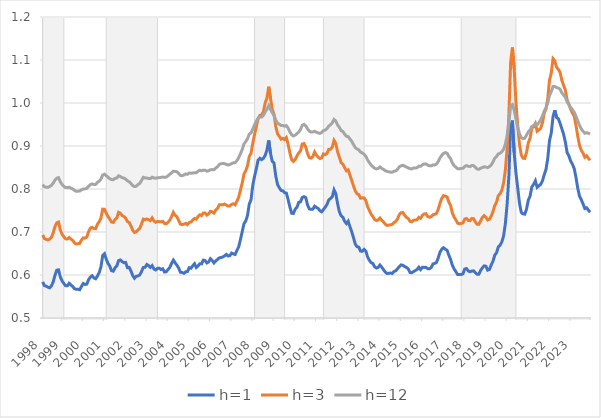
| Category | h=1 | h=3 | h=12 |
|---|---|---|---|
| 1998-02-01 | 0.584 | 0.693 | 0.81 |
| 1998-03-01 | 0.575 | 0.685 | 0.805 |
| 1998-04-01 | 0.574 | 0.683 | 0.804 |
| 1998-05-01 | 0.572 | 0.682 | 0.804 |
| 1998-06-01 | 0.57 | 0.684 | 0.806 |
| 1998-07-01 | 0.575 | 0.688 | 0.808 |
| 1998-08-01 | 0.584 | 0.698 | 0.814 |
| 1998-09-01 | 0.6 | 0.713 | 0.821 |
| 1998-10-01 | 0.611 | 0.721 | 0.825 |
| 1998-11-01 | 0.612 | 0.723 | 0.826 |
| 1998-12-01 | 0.596 | 0.705 | 0.817 |
| 1999-01-01 | 0.586 | 0.695 | 0.811 |
| 1999-02-01 | 0.58 | 0.689 | 0.806 |
| 1999-03-01 | 0.575 | 0.684 | 0.804 |
| 1999-04-01 | 0.575 | 0.684 | 0.803 |
| 1999-05-01 | 0.581 | 0.687 | 0.804 |
| 1999-06-01 | 0.577 | 0.684 | 0.802 |
| 1999-07-01 | 0.573 | 0.681 | 0.8 |
| 1999-08-01 | 0.568 | 0.675 | 0.797 |
| 1999-09-01 | 0.567 | 0.672 | 0.795 |
| 1999-10-01 | 0.567 | 0.673 | 0.795 |
| 1999-11-01 | 0.566 | 0.673 | 0.795 |
| 1999-12-01 | 0.574 | 0.681 | 0.798 |
| 2000-01-01 | 0.58 | 0.686 | 0.8 |
| 2000-02-01 | 0.578 | 0.686 | 0.8 |
| 2000-03-01 | 0.579 | 0.688 | 0.802 |
| 2000-04-01 | 0.589 | 0.7 | 0.806 |
| 2000-05-01 | 0.595 | 0.709 | 0.81 |
| 2000-06-01 | 0.598 | 0.711 | 0.812 |
| 2000-07-01 | 0.593 | 0.708 | 0.811 |
| 2000-08-01 | 0.591 | 0.708 | 0.811 |
| 2000-09-01 | 0.597 | 0.718 | 0.815 |
| 2000-10-01 | 0.605 | 0.724 | 0.818 |
| 2000-11-01 | 0.618 | 0.732 | 0.823 |
| 2000-12-01 | 0.645 | 0.753 | 0.832 |
| 2001-01-01 | 0.649 | 0.753 | 0.834 |
| 2001-02-01 | 0.637 | 0.744 | 0.831 |
| 2001-03-01 | 0.627 | 0.736 | 0.827 |
| 2001-04-01 | 0.621 | 0.73 | 0.824 |
| 2001-05-01 | 0.61 | 0.723 | 0.822 |
| 2001-06-01 | 0.609 | 0.722 | 0.822 |
| 2001-07-01 | 0.617 | 0.729 | 0.825 |
| 2001-08-01 | 0.621 | 0.733 | 0.826 |
| 2001-09-01 | 0.633 | 0.746 | 0.831 |
| 2001-10-01 | 0.635 | 0.744 | 0.829 |
| 2001-11-01 | 0.631 | 0.738 | 0.826 |
| 2001-12-01 | 0.629 | 0.736 | 0.825 |
| 2002-01-01 | 0.629 | 0.732 | 0.823 |
| 2002-02-01 | 0.617 | 0.724 | 0.819 |
| 2002-03-01 | 0.618 | 0.722 | 0.817 |
| 2002-04-01 | 0.609 | 0.714 | 0.813 |
| 2002-05-01 | 0.599 | 0.704 | 0.808 |
| 2002-06-01 | 0.592 | 0.699 | 0.806 |
| 2002-07-01 | 0.597 | 0.701 | 0.807 |
| 2002-08-01 | 0.598 | 0.705 | 0.81 |
| 2002-09-01 | 0.6 | 0.709 | 0.813 |
| 2002-10-01 | 0.608 | 0.719 | 0.82 |
| 2002-11-01 | 0.618 | 0.73 | 0.827 |
| 2002-12-01 | 0.618 | 0.729 | 0.826 |
| 2003-01-01 | 0.624 | 0.73 | 0.826 |
| 2003-02-01 | 0.622 | 0.728 | 0.824 |
| 2003-03-01 | 0.618 | 0.727 | 0.824 |
| 2003-04-01 | 0.622 | 0.733 | 0.827 |
| 2003-05-01 | 0.614 | 0.726 | 0.826 |
| 2003-06-01 | 0.612 | 0.722 | 0.825 |
| 2003-07-01 | 0.615 | 0.724 | 0.826 |
| 2003-08-01 | 0.616 | 0.724 | 0.826 |
| 2003-09-01 | 0.613 | 0.724 | 0.827 |
| 2003-10-01 | 0.614 | 0.725 | 0.828 |
| 2003-11-01 | 0.607 | 0.72 | 0.827 |
| 2003-12-01 | 0.608 | 0.719 | 0.828 |
| 2004-01-01 | 0.613 | 0.723 | 0.831 |
| 2004-02-01 | 0.618 | 0.728 | 0.834 |
| 2004-03-01 | 0.627 | 0.736 | 0.838 |
| 2004-04-01 | 0.635 | 0.746 | 0.841 |
| 2004-05-01 | 0.628 | 0.739 | 0.841 |
| 2004-06-01 | 0.623 | 0.736 | 0.84 |
| 2004-07-01 | 0.616 | 0.727 | 0.836 |
| 2004-08-01 | 0.606 | 0.718 | 0.832 |
| 2004-09-01 | 0.606 | 0.717 | 0.831 |
| 2004-10-01 | 0.604 | 0.718 | 0.833 |
| 2004-11-01 | 0.607 | 0.72 | 0.835 |
| 2004-12-01 | 0.608 | 0.717 | 0.834 |
| 2005-01-01 | 0.617 | 0.722 | 0.837 |
| 2005-02-01 | 0.616 | 0.723 | 0.837 |
| 2005-03-01 | 0.622 | 0.728 | 0.837 |
| 2005-04-01 | 0.626 | 0.732 | 0.838 |
| 2005-05-01 | 0.617 | 0.73 | 0.838 |
| 2005-06-01 | 0.621 | 0.736 | 0.841 |
| 2005-07-01 | 0.626 | 0.74 | 0.844 |
| 2005-08-01 | 0.626 | 0.738 | 0.842 |
| 2005-09-01 | 0.635 | 0.744 | 0.844 |
| 2005-10-01 | 0.633 | 0.744 | 0.844 |
| 2005-11-01 | 0.628 | 0.739 | 0.841 |
| 2005-12-01 | 0.63 | 0.742 | 0.842 |
| 2006-01-01 | 0.638 | 0.748 | 0.845 |
| 2006-02-01 | 0.634 | 0.747 | 0.845 |
| 2006-03-01 | 0.628 | 0.744 | 0.845 |
| 2006-04-01 | 0.632 | 0.751 | 0.849 |
| 2006-05-01 | 0.636 | 0.755 | 0.852 |
| 2006-06-01 | 0.64 | 0.763 | 0.857 |
| 2006-07-01 | 0.641 | 0.763 | 0.859 |
| 2006-08-01 | 0.642 | 0.763 | 0.859 |
| 2006-09-01 | 0.644 | 0.765 | 0.859 |
| 2006-10-01 | 0.648 | 0.763 | 0.857 |
| 2006-11-01 | 0.644 | 0.76 | 0.856 |
| 2006-12-01 | 0.645 | 0.761 | 0.857 |
| 2007-01-01 | 0.651 | 0.764 | 0.859 |
| 2007-02-01 | 0.649 | 0.766 | 0.861 |
| 2007-03-01 | 0.648 | 0.763 | 0.861 |
| 2007-04-01 | 0.657 | 0.771 | 0.866 |
| 2007-05-01 | 0.665 | 0.781 | 0.873 |
| 2007-06-01 | 0.682 | 0.797 | 0.882 |
| 2007-07-01 | 0.701 | 0.814 | 0.892 |
| 2007-08-01 | 0.719 | 0.835 | 0.905 |
| 2007-09-01 | 0.726 | 0.842 | 0.91 |
| 2007-10-01 | 0.739 | 0.854 | 0.917 |
| 2007-11-01 | 0.765 | 0.876 | 0.928 |
| 2007-12-01 | 0.775 | 0.883 | 0.931 |
| 2008-01-01 | 0.809 | 0.907 | 0.939 |
| 2008-02-01 | 0.83 | 0.927 | 0.949 |
| 2008-03-01 | 0.847 | 0.945 | 0.958 |
| 2008-04-01 | 0.867 | 0.964 | 0.964 |
| 2008-05-01 | 0.871 | 0.971 | 0.967 |
| 2008-06-01 | 0.868 | 0.972 | 0.967 |
| 2008-07-01 | 0.871 | 0.98 | 0.971 |
| 2008-08-01 | 0.878 | 1 | 0.979 |
| 2008-09-01 | 0.891 | 1.011 | 0.985 |
| 2008-10-01 | 0.913 | 1.038 | 0.994 |
| 2008-11-01 | 0.883 | 1.011 | 0.985 |
| 2008-12-01 | 0.864 | 0.985 | 0.977 |
| 2009-01-01 | 0.86 | 0.974 | 0.971 |
| 2009-02-01 | 0.83 | 0.946 | 0.96 |
| 2009-03-01 | 0.811 | 0.928 | 0.953 |
| 2009-04-01 | 0.803 | 0.923 | 0.951 |
| 2009-05-01 | 0.797 | 0.916 | 0.948 |
| 2009-06-01 | 0.796 | 0.918 | 0.948 |
| 2009-07-01 | 0.791 | 0.915 | 0.946 |
| 2009-08-01 | 0.791 | 0.92 | 0.948 |
| 2009-09-01 | 0.775 | 0.904 | 0.942 |
| 2009-10-01 | 0.758 | 0.884 | 0.933 |
| 2009-11-01 | 0.744 | 0.868 | 0.926 |
| 2009-12-01 | 0.743 | 0.864 | 0.923 |
| 2010-01-01 | 0.753 | 0.869 | 0.925 |
| 2010-02-01 | 0.758 | 0.877 | 0.929 |
| 2010-03-01 | 0.769 | 0.884 | 0.933 |
| 2010-04-01 | 0.77 | 0.889 | 0.938 |
| 2010-05-01 | 0.78 | 0.905 | 0.948 |
| 2010-06-01 | 0.782 | 0.906 | 0.95 |
| 2010-07-01 | 0.78 | 0.897 | 0.947 |
| 2010-08-01 | 0.763 | 0.883 | 0.94 |
| 2010-09-01 | 0.754 | 0.873 | 0.935 |
| 2010-10-01 | 0.753 | 0.872 | 0.933 |
| 2010-11-01 | 0.753 | 0.875 | 0.933 |
| 2010-12-01 | 0.76 | 0.886 | 0.934 |
| 2011-01-01 | 0.757 | 0.879 | 0.932 |
| 2011-02-01 | 0.755 | 0.874 | 0.931 |
| 2011-03-01 | 0.75 | 0.871 | 0.929 |
| 2011-04-01 | 0.747 | 0.873 | 0.931 |
| 2011-05-01 | 0.752 | 0.882 | 0.936 |
| 2011-06-01 | 0.758 | 0.88 | 0.937 |
| 2011-07-01 | 0.764 | 0.883 | 0.94 |
| 2011-08-01 | 0.775 | 0.892 | 0.946 |
| 2011-09-01 | 0.778 | 0.892 | 0.949 |
| 2011-10-01 | 0.782 | 0.897 | 0.954 |
| 2011-11-01 | 0.798 | 0.913 | 0.962 |
| 2011-12-01 | 0.789 | 0.906 | 0.958 |
| 2012-01-01 | 0.766 | 0.887 | 0.949 |
| 2012-02-01 | 0.747 | 0.874 | 0.944 |
| 2012-03-01 | 0.738 | 0.861 | 0.936 |
| 2012-04-01 | 0.734 | 0.858 | 0.934 |
| 2012-05-01 | 0.725 | 0.85 | 0.928 |
| 2012-06-01 | 0.72 | 0.842 | 0.923 |
| 2012-07-01 | 0.725 | 0.844 | 0.922 |
| 2012-08-01 | 0.712 | 0.832 | 0.916 |
| 2012-09-01 | 0.701 | 0.82 | 0.911 |
| 2012-10-01 | 0.687 | 0.807 | 0.904 |
| 2012-11-01 | 0.672 | 0.796 | 0.897 |
| 2012-12-01 | 0.666 | 0.789 | 0.893 |
| 2013-01-01 | 0.665 | 0.787 | 0.891 |
| 2013-02-01 | 0.656 | 0.779 | 0.886 |
| 2013-03-01 | 0.655 | 0.779 | 0.884 |
| 2013-04-01 | 0.66 | 0.779 | 0.881 |
| 2013-05-01 | 0.656 | 0.773 | 0.876 |
| 2013-06-01 | 0.642 | 0.759 | 0.868 |
| 2013-07-01 | 0.634 | 0.75 | 0.861 |
| 2013-08-01 | 0.629 | 0.741 | 0.856 |
| 2013-09-01 | 0.627 | 0.735 | 0.851 |
| 2013-10-01 | 0.619 | 0.729 | 0.848 |
| 2013-11-01 | 0.616 | 0.727 | 0.847 |
| 2013-12-01 | 0.618 | 0.728 | 0.848 |
| 2014-01-01 | 0.623 | 0.733 | 0.851 |
| 2014-02-01 | 0.618 | 0.727 | 0.848 |
| 2014-03-01 | 0.612 | 0.723 | 0.846 |
| 2014-04-01 | 0.607 | 0.718 | 0.843 |
| 2014-05-01 | 0.604 | 0.715 | 0.841 |
| 2014-06-01 | 0.604 | 0.716 | 0.84 |
| 2014-07-01 | 0.605 | 0.717 | 0.839 |
| 2014-08-01 | 0.604 | 0.718 | 0.839 |
| 2014-09-01 | 0.609 | 0.722 | 0.841 |
| 2014-10-01 | 0.61 | 0.725 | 0.842 |
| 2014-11-01 | 0.615 | 0.731 | 0.846 |
| 2014-12-01 | 0.619 | 0.741 | 0.852 |
| 2015-01-01 | 0.623 | 0.745 | 0.854 |
| 2015-02-01 | 0.623 | 0.745 | 0.855 |
| 2015-03-01 | 0.62 | 0.739 | 0.853 |
| 2015-04-01 | 0.618 | 0.734 | 0.851 |
| 2015-05-01 | 0.614 | 0.731 | 0.849 |
| 2015-06-01 | 0.606 | 0.725 | 0.847 |
| 2015-07-01 | 0.605 | 0.724 | 0.847 |
| 2015-08-01 | 0.608 | 0.727 | 0.849 |
| 2015-09-01 | 0.61 | 0.728 | 0.849 |
| 2015-10-01 | 0.613 | 0.729 | 0.849 |
| 2015-11-01 | 0.618 | 0.734 | 0.853 |
| 2015-12-01 | 0.613 | 0.732 | 0.853 |
| 2016-01-01 | 0.618 | 0.739 | 0.856 |
| 2016-02-01 | 0.618 | 0.742 | 0.858 |
| 2016-03-01 | 0.618 | 0.743 | 0.858 |
| 2016-04-01 | 0.615 | 0.736 | 0.856 |
| 2016-05-01 | 0.614 | 0.734 | 0.854 |
| 2016-06-01 | 0.617 | 0.735 | 0.854 |
| 2016-07-01 | 0.626 | 0.74 | 0.856 |
| 2016-08-01 | 0.627 | 0.741 | 0.856 |
| 2016-09-01 | 0.629 | 0.743 | 0.858 |
| 2016-10-01 | 0.64 | 0.753 | 0.864 |
| 2016-11-01 | 0.653 | 0.767 | 0.872 |
| 2016-12-01 | 0.66 | 0.778 | 0.878 |
| 2017-01-01 | 0.663 | 0.785 | 0.883 |
| 2017-02-01 | 0.66 | 0.783 | 0.885 |
| 2017-03-01 | 0.658 | 0.782 | 0.883 |
| 2017-04-01 | 0.646 | 0.769 | 0.875 |
| 2017-05-01 | 0.636 | 0.762 | 0.871 |
| 2017-06-01 | 0.622 | 0.744 | 0.86 |
| 2017-07-01 | 0.614 | 0.735 | 0.854 |
| 2017-08-01 | 0.608 | 0.728 | 0.851 |
| 2017-09-01 | 0.601 | 0.72 | 0.847 |
| 2017-10-01 | 0.601 | 0.719 | 0.847 |
| 2017-11-01 | 0.601 | 0.72 | 0.848 |
| 2017-12-01 | 0.603 | 0.721 | 0.848 |
| 2018-01-01 | 0.614 | 0.73 | 0.853 |
| 2018-02-01 | 0.615 | 0.731 | 0.854 |
| 2018-03-01 | 0.609 | 0.727 | 0.853 |
| 2018-04-01 | 0.608 | 0.726 | 0.852 |
| 2018-05-01 | 0.609 | 0.732 | 0.855 |
| 2018-06-01 | 0.61 | 0.731 | 0.854 |
| 2018-07-01 | 0.605 | 0.723 | 0.85 |
| 2018-08-01 | 0.602 | 0.718 | 0.847 |
| 2018-09-01 | 0.602 | 0.718 | 0.846 |
| 2018-10-01 | 0.611 | 0.726 | 0.848 |
| 2018-11-01 | 0.617 | 0.734 | 0.85 |
| 2018-12-01 | 0.621 | 0.738 | 0.852 |
| 2019-01-01 | 0.62 | 0.734 | 0.851 |
| 2019-02-01 | 0.611 | 0.728 | 0.85 |
| 2019-03-01 | 0.613 | 0.73 | 0.852 |
| 2019-04-01 | 0.624 | 0.737 | 0.856 |
| 2019-05-01 | 0.632 | 0.747 | 0.863 |
| 2019-06-01 | 0.646 | 0.762 | 0.872 |
| 2019-07-01 | 0.652 | 0.769 | 0.876 |
| 2019-08-01 | 0.665 | 0.785 | 0.882 |
| 2019-09-01 | 0.669 | 0.789 | 0.883 |
| 2019-10-01 | 0.677 | 0.797 | 0.887 |
| 2019-11-01 | 0.691 | 0.814 | 0.892 |
| 2019-12-01 | 0.719 | 0.844 | 0.904 |
| 2020-01-01 | 0.765 | 0.893 | 0.924 |
| 2020-02-01 | 0.83 | 0.973 | 0.954 |
| 2020-03-01 | 0.945 | 1.095 | 0.993 |
| 2020-04-01 | 0.959 | 1.129 | 0.996 |
| 2020-05-01 | 0.884 | 1.08 | 0.983 |
| 2020-06-01 | 0.838 | 1.001 | 0.962 |
| 2020-07-01 | 0.803 | 0.947 | 0.944 |
| 2020-08-01 | 0.767 | 0.904 | 0.929 |
| 2020-09-01 | 0.746 | 0.879 | 0.92 |
| 2020-10-01 | 0.742 | 0.872 | 0.917 |
| 2020-11-01 | 0.742 | 0.871 | 0.918 |
| 2020-12-01 | 0.754 | 0.885 | 0.925 |
| 2021-01-01 | 0.774 | 0.907 | 0.933 |
| 2021-02-01 | 0.783 | 0.918 | 0.937 |
| 2021-03-01 | 0.805 | 0.942 | 0.946 |
| 2021-04-01 | 0.811 | 0.944 | 0.947 |
| 2021-05-01 | 0.819 | 0.952 | 0.952 |
| 2021-06-01 | 0.804 | 0.934 | 0.949 |
| 2021-07-01 | 0.807 | 0.937 | 0.954 |
| 2021-08-01 | 0.811 | 0.941 | 0.961 |
| 2021-09-01 | 0.819 | 0.954 | 0.97 |
| 2021-10-01 | 0.833 | 0.976 | 0.981 |
| 2021-11-01 | 0.845 | 0.986 | 0.989 |
| 2021-12-01 | 0.87 | 1.01 | 1 |
| 2022-01-01 | 0.913 | 1.053 | 1.018 |
| 2022-02-01 | 0.93 | 1.069 | 1.026 |
| 2022-03-01 | 0.968 | 1.103 | 1.038 |
| 2022-04-01 | 0.983 | 1.098 | 1.038 |
| 2022-05-01 | 0.966 | 1.083 | 1.036 |
| 2022-06-01 | 0.964 | 1.078 | 1.035 |
| 2022-07-01 | 0.953 | 1.071 | 1.032 |
| 2022-08-01 | 0.94 | 1.053 | 1.024 |
| 2022-09-01 | 0.927 | 1.041 | 1.018 |
| 2022-10-01 | 0.909 | 1.03 | 1.013 |
| 2022-11-01 | 0.884 | 1.007 | 1.002 |
| 2022-12-01 | 0.877 | 0.996 | 0.996 |
| 2023-01-01 | 0.865 | 0.986 | 0.99 |
| 2023-02-01 | 0.857 | 0.976 | 0.984 |
| 2023-03-01 | 0.847 | 0.97 | 0.978 |
| 2023-04-01 | 0.827 | 0.948 | 0.969 |
| 2023-05-01 | 0.802 | 0.923 | 0.959 |
| 2023-06-01 | 0.783 | 0.901 | 0.948 |
| 2023-07-01 | 0.775 | 0.89 | 0.94 |
| 2023-08-01 | 0.765 | 0.883 | 0.934 |
| 2023-09-01 | 0.755 | 0.874 | 0.93 |
| 2023-10-01 | 0.756 | 0.877 | 0.931 |
| 2023-11-01 | 0.751 | 0.872 | 0.93 |
| 2023-12-01 | 0.746 | 0.867 | 0.928 |